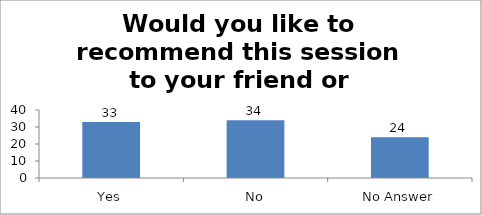
| Category | Would you like to recommend this session to your friend or colleague? |
|---|---|
| Yes | 33 |
| No | 34 |
| No Answer | 24 |